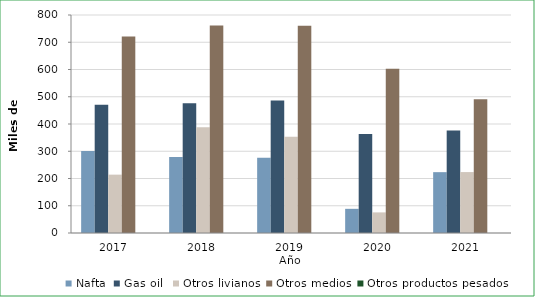
| Category | Nafta | Gas oil  | Otros livianos | Otros medios | Otros productos pesados |
|---|---|---|---|---|---|
| 2017.0 | 300697.531 | 470778.781 | 214158 | 720711.064 | 0 |
| 2018.0 | 278819 | 476263.14 | 387929 | 761060.065 | 0 |
| 2019.0 | 275731.75 | 486010.248 | 353251.91 | 760344.497 | 0 |
| 2020.0 | 88714.33 | 363303.767 | 75624.14 | 603061.465 | 0 |
| 2021.0 | 223280.95 | 375776.921 | 223582.04 | 490750.35 | 0 |